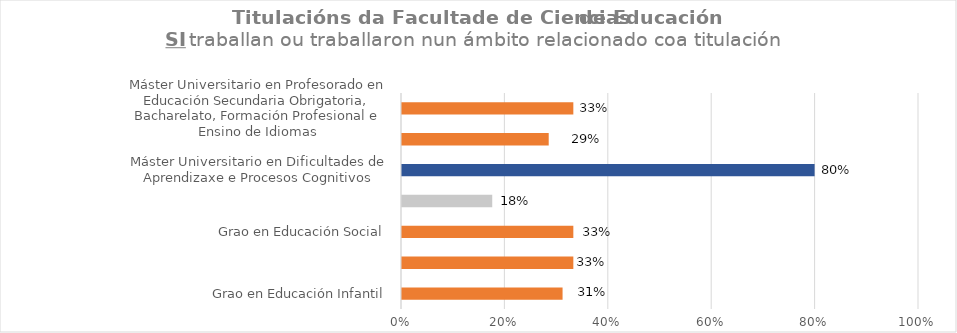
| Category | Series 1 |
|---|---|
| Grao en Educación Infantil | 0.312 |
| Grao en Educación Primaria | 0.333 |
| Grao en Educación Social | 0.333 |
| Grao en Traballo Social | 0.176 |
| Máster Universitario en Dificultades de Aprendizaxe e Procesos Cognitivos | 0.8 |
| Máster Universitario en Intervención Multidisciplinar na Diversidade en Contextos Educativos | 0.286 |
| Máster Universitario en Profesorado en Educación Secundaria Obrigatoria, Bacharelato, Formación Profesional e Ensino de Idiomas | 0.333 |